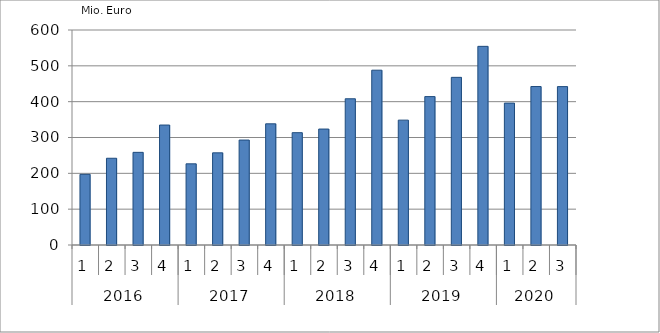
| Category | Ausbaugewerblicher Umsatz3 |
|---|---|
| 0 | 197219.532 |
| 1 | 242069.899 |
| 2 | 258547.84 |
| 3 | 334764.305 |
| 4 | 226552.317 |
| 5 | 257191.13 |
| 6 | 292853.372 |
| 7 | 338154.691 |
| 8 | 313433.569 |
| 9 | 323547.694 |
| 10 | 408057.42 |
| 11 | 487843.765 |
| 12 | 348466.115 |
| 13 | 414145.554 |
| 14 | 467849.207 |
| 15 | 554369.34 |
| 16 | 395996.128 |
| 17 | 442270.528 |
| 18 | 441987.109 |